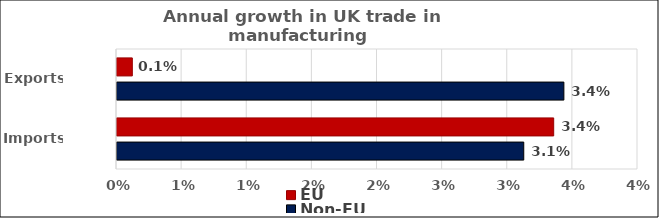
| Category | EU | Non-EU  |
|---|---|---|
| Exports  | 0.001 | 0.034 |
| Imports | 0.034 | 0.031 |